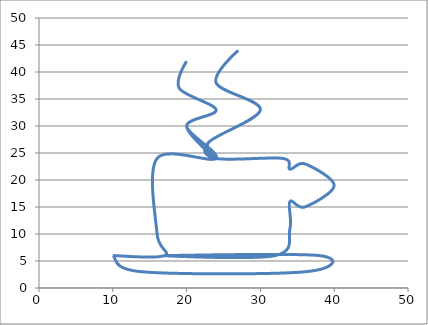
| Category | Series 0 |
|---|---|
| 10.0 | 6 |
| 17.0 | 6 |
| 16.0 | 10 |
| 16.0 | 24 |
| 24.0 | 24 |
| 20.0 | 30 |
| 24.0 | 33 |
| 19.0 | 37 |
| 20.0 | 42 |
| 19.0 | 37 |
| 24.0 | 33 |
| 20.0 | 30 |
| 24.0 | 24 |
| 23.0 | 27 |
| 30.0 | 33 |
| 24.0 | 38 |
| 27.0 | 44 |
| 24.0 | 38 |
| 30.0 | 33 |
| 23.0 | 27 |
| 24.0 | 24 |
| 33.0 | 24 |
| 34.0 | 22 |
| 36.0 | 23 |
| 40.0 | 19 |
| 36.0 | 15 |
| 34.0 | 16 |
| 34.0 | 11 |
| 32.0 | 6 |
| 17.0 | 6 |
| 38.0 | 6 |
| 36.0 | 3 |
| 14.0 | 3 |
| 10.0 | 6 |